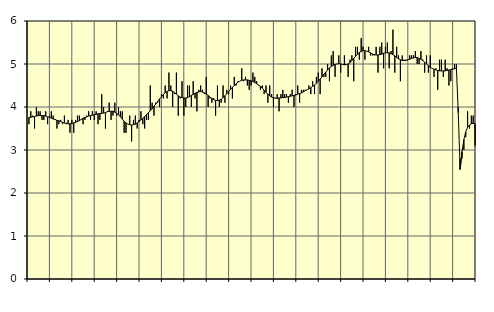
| Category | Hotell och restaurang, SNI 55-56 | Series 1 |
|---|---|---|
| nan | 3.6 | 3.76 |
| 1.0 | 3.9 | 3.76 |
| 1.0 | 3.8 | 3.77 |
| 1.0 | 3.5 | 3.78 |
| 1.0 | 4 | 3.79 |
| 1.0 | 3.9 | 3.8 |
| 1.0 | 3.9 | 3.8 |
| 1.0 | 3.7 | 3.8 |
| 1.0 | 3.7 | 3.8 |
| 1.0 | 3.9 | 3.79 |
| 1.0 | 3.6 | 3.77 |
| 1.0 | 3.8 | 3.76 |
| nan | 3.9 | 3.74 |
| 2.0 | 3.8 | 3.72 |
| 2.0 | 3.7 | 3.71 |
| 2.0 | 3.5 | 3.69 |
| 2.0 | 3.6 | 3.68 |
| 2.0 | 3.7 | 3.66 |
| 2.0 | 3.6 | 3.64 |
| 2.0 | 3.8 | 3.63 |
| 2.0 | 3.6 | 3.62 |
| 2.0 | 3.7 | 3.61 |
| 2.0 | 3.4 | 3.61 |
| 2.0 | 3.7 | 3.62 |
| nan | 3.4 | 3.63 |
| 3.0 | 3.7 | 3.64 |
| 3.0 | 3.8 | 3.66 |
| 3.0 | 3.8 | 3.68 |
| 3.0 | 3.7 | 3.71 |
| 3.0 | 3.6 | 3.74 |
| 3.0 | 3.7 | 3.76 |
| 3.0 | 3.8 | 3.77 |
| 3.0 | 3.9 | 3.79 |
| 3.0 | 3.7 | 3.8 |
| 3.0 | 3.9 | 3.81 |
| 3.0 | 3.7 | 3.82 |
| nan | 3.9 | 3.83 |
| 4.0 | 3.6 | 3.84 |
| 4.0 | 3.7 | 3.85 |
| 4.0 | 4.3 | 3.85 |
| 4.0 | 4 | 3.86 |
| 4.0 | 3.5 | 3.87 |
| 4.0 | 3.9 | 3.89 |
| 4.0 | 4.1 | 3.9 |
| 4.0 | 3.7 | 3.9 |
| 4.0 | 3.8 | 3.9 |
| 4.0 | 4.1 | 3.88 |
| 4.0 | 3.8 | 3.85 |
| nan | 4 | 3.82 |
| 5.0 | 3.9 | 3.77 |
| 5.0 | 3.9 | 3.72 |
| 5.0 | 3.4 | 3.67 |
| 5.0 | 3.4 | 3.63 |
| 5.0 | 3.6 | 3.6 |
| 5.0 | 3.8 | 3.59 |
| 5.0 | 3.2 | 3.58 |
| 5.0 | 3.7 | 3.59 |
| 5.0 | 3.8 | 3.6 |
| 5.0 | 3.5 | 3.63 |
| 5.0 | 3.7 | 3.66 |
| nan | 3.9 | 3.7 |
| 6.0 | 3.6 | 3.74 |
| 6.0 | 3.5 | 3.78 |
| 6.0 | 3.7 | 3.82 |
| 6.0 | 3.7 | 3.87 |
| 6.0 | 4.5 | 3.91 |
| 6.0 | 4.1 | 3.96 |
| 6.0 | 3.8 | 4.02 |
| 6.0 | 4.1 | 4.07 |
| 6.0 | 4.1 | 4.13 |
| 6.0 | 4 | 4.19 |
| 6.0 | 4.3 | 4.24 |
| nan | 4.2 | 4.29 |
| 7.0 | 4.5 | 4.33 |
| 7.0 | 4.2 | 4.36 |
| 7.0 | 4.8 | 4.38 |
| 7.0 | 4.5 | 4.38 |
| 7.0 | 4 | 4.37 |
| 7.0 | 4.3 | 4.33 |
| 7.0 | 4.8 | 4.3 |
| 7.0 | 3.8 | 4.26 |
| 7.0 | 4.2 | 4.23 |
| 7.0 | 4.6 | 4.22 |
| 7.0 | 3.8 | 4.21 |
| nan | 4 | 4.21 |
| 8.0 | 4.5 | 4.22 |
| 8.0 | 4.5 | 4.24 |
| 8.0 | 4 | 4.27 |
| 8.0 | 4.6 | 4.29 |
| 8.0 | 4.2 | 4.32 |
| 8.0 | 3.9 | 4.34 |
| 8.0 | 4.4 | 4.35 |
| 8.0 | 4.5 | 4.36 |
| 8.0 | 4.4 | 4.35 |
| 8.0 | 4.3 | 4.33 |
| 8.0 | 4.7 | 4.3 |
| nan | 4 | 4.27 |
| 9.0 | 4.2 | 4.23 |
| 9.0 | 4.1 | 4.2 |
| 9.0 | 4.2 | 4.17 |
| 9.0 | 3.8 | 4.15 |
| 9.0 | 4.5 | 4.15 |
| 9.0 | 4 | 4.16 |
| 9.0 | 4.1 | 4.18 |
| 9.0 | 4.5 | 4.22 |
| 9.0 | 4.1 | 4.26 |
| 9.0 | 4.4 | 4.31 |
| 9.0 | 4.3 | 4.36 |
| nan | 4.5 | 4.41 |
| 10.0 | 4.2 | 4.46 |
| 10.0 | 4.7 | 4.5 |
| 10.0 | 4.5 | 4.54 |
| 10.0 | 4.6 | 4.58 |
| 10.0 | 4.6 | 4.6 |
| 10.0 | 4.9 | 4.62 |
| 10.0 | 4.6 | 4.63 |
| 10.0 | 4.7 | 4.63 |
| 10.0 | 4.5 | 4.63 |
| 10.0 | 4.4 | 4.62 |
| 10.0 | 4.5 | 4.61 |
| nan | 4.8 | 4.59 |
| 11.0 | 4.7 | 4.57 |
| 11.0 | 4.6 | 4.54 |
| 11.0 | 4.5 | 4.51 |
| 11.0 | 4.4 | 4.48 |
| 11.0 | 4.5 | 4.44 |
| 11.0 | 4.3 | 4.39 |
| 11.0 | 4.5 | 4.34 |
| 11.0 | 4.1 | 4.3 |
| 11.0 | 4.5 | 4.26 |
| 11.0 | 4.3 | 4.23 |
| 11.0 | 4 | 4.22 |
| nan | 4.2 | 4.21 |
| 12.0 | 4.3 | 4.2 |
| 12.0 | 3.9 | 4.21 |
| 12.0 | 4.3 | 4.21 |
| 12.0 | 4.4 | 4.22 |
| 12.0 | 4.3 | 4.22 |
| 12.0 | 4.3 | 4.23 |
| 12.0 | 4.1 | 4.24 |
| 12.0 | 4.3 | 4.25 |
| 12.0 | 4.4 | 4.26 |
| 12.0 | 4 | 4.27 |
| 12.0 | 4.3 | 4.28 |
| nan | 4.5 | 4.3 |
| 13.0 | 4.1 | 4.31 |
| 13.0 | 4.4 | 4.33 |
| 13.0 | 4.4 | 4.35 |
| 13.0 | 4.4 | 4.38 |
| 13.0 | 4.4 | 4.4 |
| 13.0 | 4.5 | 4.42 |
| 13.0 | 4.3 | 4.45 |
| 13.0 | 4.6 | 4.48 |
| 13.0 | 4.3 | 4.51 |
| 13.0 | 4.7 | 4.55 |
| 13.0 | 4.8 | 4.6 |
| nan | 4.3 | 4.65 |
| 14.0 | 4.9 | 4.7 |
| 14.0 | 4.7 | 4.76 |
| 14.0 | 4.7 | 4.81 |
| 14.0 | 5 | 4.86 |
| 14.0 | 4.6 | 4.91 |
| 14.0 | 5.2 | 4.94 |
| 14.0 | 5.3 | 4.97 |
| 14.0 | 4.7 | 4.99 |
| 14.0 | 5 | 5 |
| 14.0 | 5.2 | 5.01 |
| 14.0 | 4.8 | 5 |
| nan | 5 | 4.99 |
| 15.0 | 5.2 | 4.98 |
| 15.0 | 5 | 4.99 |
| 15.0 | 4.7 | 5 |
| 15.0 | 5.1 | 5.03 |
| 15.0 | 5.2 | 5.08 |
| 15.0 | 4.6 | 5.13 |
| 15.0 | 5.4 | 5.18 |
| 15.0 | 5.4 | 5.22 |
| 15.0 | 5.1 | 5.27 |
| 15.0 | 5.6 | 5.29 |
| 15.0 | 5.4 | 5.31 |
| nan | 5.1 | 5.31 |
| 16.0 | 5.3 | 5.3 |
| 16.0 | 5.4 | 5.28 |
| 16.0 | 5.2 | 5.26 |
| 16.0 | 5.2 | 5.23 |
| 16.0 | 5.2 | 5.22 |
| 16.0 | 5.4 | 5.21 |
| 16.0 | 4.8 | 5.21 |
| 16.0 | 5.4 | 5.22 |
| 16.0 | 5.5 | 5.23 |
| 16.0 | 4.9 | 5.25 |
| 16.0 | 5.4 | 5.26 |
| nan | 5.5 | 5.26 |
| 17.0 | 4.9 | 5.26 |
| 17.0 | 5.3 | 5.24 |
| 17.0 | 5.8 | 5.22 |
| 17.0 | 4.8 | 5.19 |
| 17.0 | 5.4 | 5.15 |
| 17.0 | 5.2 | 5.12 |
| 17.0 | 4.6 | 5.1 |
| 17.0 | 5.2 | 5.08 |
| 17.0 | 5.1 | 5.08 |
| 17.0 | 5.1 | 5.08 |
| 17.0 | 5.1 | 5.1 |
| nan | 5.2 | 5.11 |
| 18.0 | 5.2 | 5.13 |
| 18.0 | 5.2 | 5.14 |
| 18.0 | 5.3 | 5.15 |
| 18.0 | 5 | 5.15 |
| 18.0 | 5 | 5.13 |
| 18.0 | 5.3 | 5.11 |
| 18.0 | 5.1 | 5.08 |
| 18.0 | 4.8 | 5.04 |
| 18.0 | 5.2 | 5 |
| 18.0 | 4.8 | 4.96 |
| 18.0 | 5.2 | 4.92 |
| nan | 4.9 | 4.9 |
| 19.0 | 4.7 | 4.88 |
| 19.0 | 4.9 | 4.86 |
| 19.0 | 4.4 | 4.85 |
| 19.0 | 5.1 | 4.84 |
| 19.0 | 5.1 | 4.84 |
| 19.0 | 4.7 | 4.84 |
| 19.0 | 5.1 | 4.84 |
| 19.0 | 4.9 | 4.85 |
| 19.0 | 4.5 | 4.86 |
| 19.0 | 4.6 | 4.87 |
| 19.0 | 4.9 | 4.88 |
| nan | 5 | 4.89 |
| 20.0 | 5 | 4.91 |
| 20.0 | 4 | 3.87 |
| 20.0 | 2.8 | 2.55 |
| 20.0 | 2.8 | 2.96 |
| 20.0 | 3 | 3.24 |
| 20.0 | 3.3 | 3.42 |
| 20.0 | 3.9 | 3.53 |
| 20.0 | 3.5 | 3.58 |
| 20.0 | 3.8 | 3.61 |
| 20.0 | 3.8 | 3.62 |
| 20.0 | 3.1 | 3.61 |